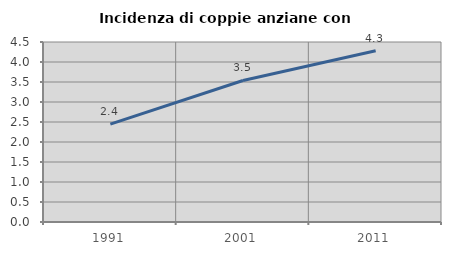
| Category | Incidenza di coppie anziane con figli |
|---|---|
| 1991.0 | 2.447 |
| 2001.0 | 3.538 |
| 2011.0 | 4.28 |